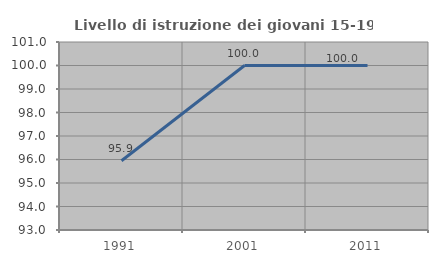
| Category | Livello di istruzione dei giovani 15-19 anni |
|---|---|
| 1991.0 | 95.946 |
| 2001.0 | 100 |
| 2011.0 | 100 |